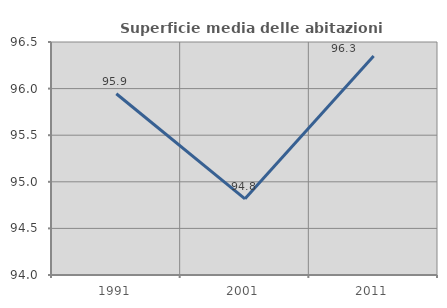
| Category | Superficie media delle abitazioni occupate |
|---|---|
| 1991.0 | 95.945 |
| 2001.0 | 94.818 |
| 2011.0 | 96.349 |